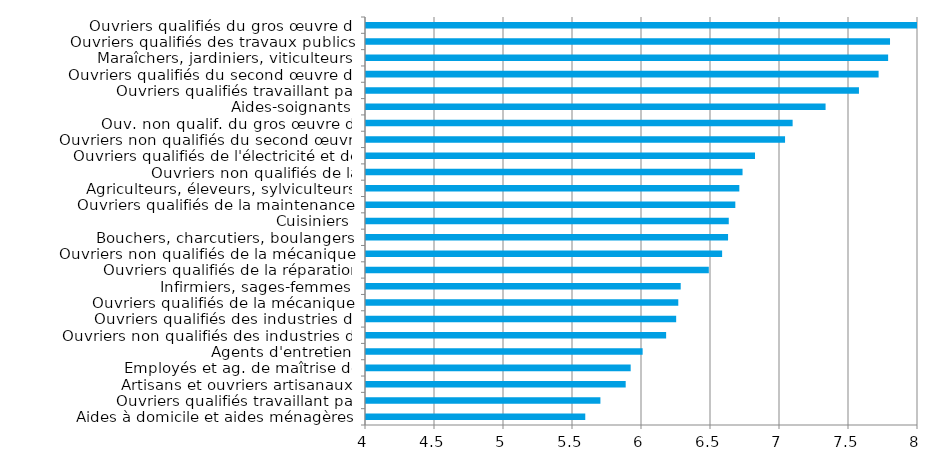
| Category | Series 0 |
|---|---|
| Aides à domicile et aides ménagères | 5.589 |
| Ouvriers qualifiés travaillant par enlèvement de métal | 5.699 |
| Artisans et ouvriers artisanaux | 5.882 |
| Employés et ag. de maîtrise de l'hôtellerie-restauration | 5.918 |
| Agents d'entretien | 6.005 |
| Ouvriers non qualifiés des industries de process | 6.175 |
| Ouvriers qualifiés des industries de process | 6.248 |
| Ouvriers qualifiés de la mécanique | 6.263 |
| Infirmiers, sages-femmes | 6.28 |
| Ouvriers qualifiés de la réparation automobile | 6.484 |
| Ouvriers non qualifiés de la mécanique | 6.581 |
| Bouchers, charcutiers, boulangers | 6.624 |
| Cuisiniers | 6.629 |
| Ouvriers qualifiés de la maintenance | 6.676 |
| Agriculteurs, éleveurs, sylviculteurs, bûcherons | 6.705 |
| Ouvriers non qualifiés de la manutention | 6.729 |
| Ouvriers qualifiés de l'électricité et de l'électronique | 6.819 |
| Ouvriers non qualifiés du second œuvre du bâtiment | 7.037 |
| Ouv. non qualif. du gros œuvre du bâtiment et tr. publics | 7.091 |
| Aides-soignants | 7.33 |
| Ouvriers qualifiés travaillant par formage de métal | 7.572 |
| Ouvriers qualifiés du second œuvre du bâtiment | 7.715 |
| Maraîchers, jardiniers, viticulteurs | 7.784 |
| Ouvriers qualifiés des travaux publics | 7.797 |
| Ouvriers qualifiés du gros œuvre du bâtiment | 8.027 |